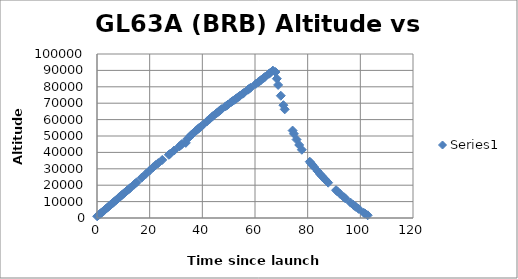
| Category | Series 0 |
|---|---|
| 0.07 | 1040 |
| 0.5700000000000001 | 1712 |
| 1.0533333333333486 | 2392 |
| 1.5533333333333486 | 3064 |
| 2.0533333333333483 | 3734 |
| 2.536666666666697 | 4396 |
| 3.036666666666697 | 5099 |
| 3.5199999999999316 | 5775 |
| 4.036666666666697 | 6454 |
| 4.519999999999932 | 7153 |
| 5.019999999999932 | 7815 |
| 5.519999999999932 | 8491 |
| 6.019999999999932 | 9200 |
| 6.519999999999932 | 9902 |
| 7.036666666666697 | 10611 |
| 7.519999999999932 | 11307 |
| 8.036666666666697 | 12006 |
| 8.519999999999932 | 12698 |
| 9.036666666666697 | 13403 |
| 9.519999999999932 | 14102 |
| 10.036666666666697 | 14788 |
| 10.519999999999932 | 15497 |
| 11.036666666666697 | 16163 |
| 11.519999999999932 | 16822 |
| 12.036666666666697 | 17495 |
| 12.519999999999932 | 18181 |
| 14.036666666666697 | 20317 |
| 14.519999999999932 | 21016 |
| 15.036666666666697 | 21738 |
| 17.019999999999932 | 24645 |
| 18.519999999999932 | 26837 |
| 20.036666666666697 | 28980 |
| 21.286666666666697 | 30860 |
| 22.286666666666697 | 32313 |
| 23.286666666666697 | 33491 |
| 24.786666666666697 | 35411 |
| 27.286666666666697 | 38554 |
| 27.786666666666697 | 39178 |
| 29.286666666666697 | 41143 |
| 31.286666666666697 | 43663 |
| 31.786666666666697 | 44355 |
| 32.2866666666667 | 45136 |
| 33.73666666666663 | 45816 |
| 34.2866666666667 | 48168 |
| 35.2866666666667 | 49750 |
| 35.7866666666667 | 50573 |
| 36.2866666666667 | 51331 |
| 37.2866666666667 | 52811 |
| 37.7866666666667 | 53454 |
| 38.2866666666667 | 54219 |
| 38.7866666666667 | 54865 |
| 39.2866666666667 | 55525 |
| 40.2866666666667 | 56880 |
| 41.7866666666667 | 58957 |
| 42.7866666666667 | 60365 |
| 43.7866666666667 | 61831 |
| 44.2866666666667 | 62524 |
| 45.2866666666667 | 63757 |
| 45.7866666666667 | 64374 |
| 46.2866666666667 | 65063 |
| 46.7866666666667 | 65638 |
| 47.2866666666667 | 66373 |
| 48.7866666666667 | 68040 |
| 49.2866666666667 | 68610 |
| 49.7866666666667 | 69204 |
| 50.7866666666667 | 70458 |
| 51.2866666666667 | 71039 |
| 51.7866666666667 | 71616 |
| 52.2866666666667 | 72154 |
| 52.7866666666667 | 72748 |
| 53.2866666666667 | 73339 |
| 53.7866666666667 | 73942 |
| 54.2866666666667 | 74543 |
| 55.2866666666667 | 75734 |
| 55.7866666666667 | 76305 |
| 57.2866666666667 | 78195 |
| 57.7866666666667 | 78789 |
| 58.2866666666667 | 79393 |
| 60.2866666666667 | 81722 |
| 61.2866666666667 | 82881 |
| 61.7866666666667 | 83478 |
| 62.2866666666667 | 84108 |
| 63.2866666666667 | 85371 |
| 63.7866666666667 | 86004 |
| 65.28666666666669 | 87917 |
| 65.78666666666669 | 88557 |
| 66.78666666666669 | 89863 |
| 67.78666666666669 | 88997 |
| 68.28666666666669 | 84938 |
| 68.78666666666669 | 81125 |
| 69.78666666666669 | 74553 |
| 70.78666666666669 | 68794 |
| 71.28666666666669 | 66258 |
| 74.28666666666669 | 53307 |
| 74.78666666666669 | 51345 |
| 75.78666666666669 | 47837 |
| 76.78666666666669 | 44523 |
| 77.78666666666669 | 41606 |
| 80.78666666666669 | 34328 |
| 81.28666666666669 | 33330 |
| 81.78666666666669 | 32340 |
| 82.28666666666669 | 31362 |
| 83.78666666666669 | 28589 |
| 84.78666666666669 | 26660 |
| 85.28666666666669 | 25764 |
| 86.28666666666669 | 24038 |
| 86.78666666666669 | 23182 |
| 87.28666666666669 | 22351 |
| 87.78666666666669 | 21541 |
| 90.78666666666669 | 16967 |
| 91.28666666666669 | 16206 |
| 92.28666666666669 | 14765 |
| 93.78666666666669 | 12659 |
| 94.28666666666669 | 11966 |
| 96.28666666666669 | 9351 |
| 97.30333333333334 | 8062 |
| 97.78666666666669 | 7428 |
| 98.30333333333334 | 6798 |
| 99.33666666666664 | 5578 |
| 101.30333333333334 | 3172 |
| 101.80333333333334 | 2690 |
| 102.80333333333334 | 1660 |